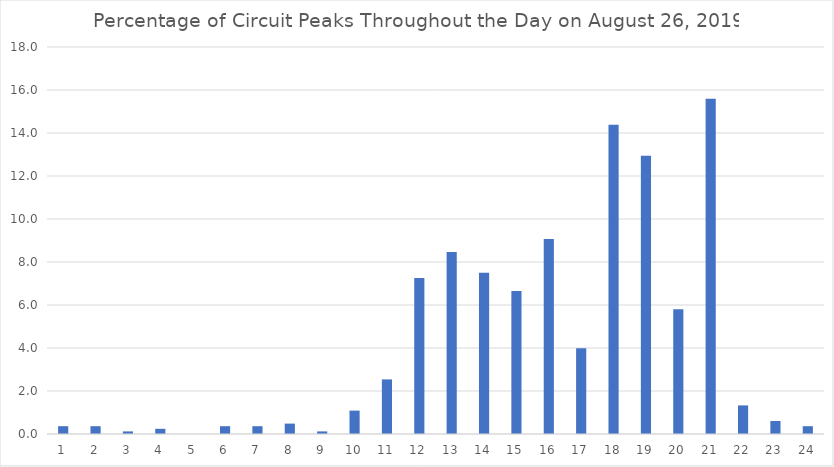
| Category | Series 0 |
|---|---|
| 0 | 0.363 |
| 1 | 0.363 |
| 2 | 0.121 |
| 3 | 0.242 |
| 4 | 0 |
| 5 | 0.363 |
| 6 | 0.363 |
| 7 | 0.484 |
| 8 | 0.121 |
| 9 | 1.088 |
| 10 | 2.539 |
| 11 | 7.255 |
| 12 | 8.464 |
| 13 | 7.497 |
| 14 | 6.651 |
| 15 | 9.069 |
| 16 | 3.99 |
| 17 | 14.389 |
| 18 | 12.938 |
| 19 | 5.804 |
| 20 | 15.599 |
| 21 | 1.33 |
| 22 | 0.605 |
| 23 | 0.363 |